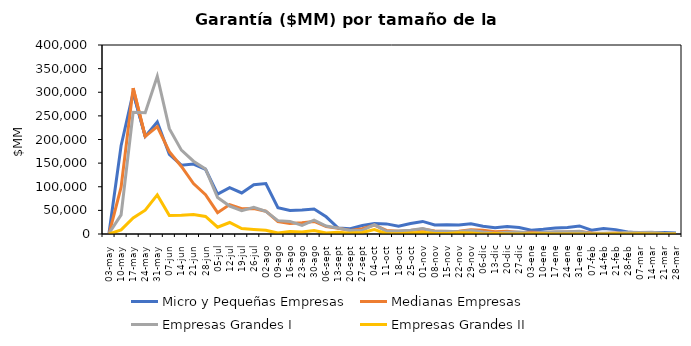
| Category | Micro y Pequeñas Empresas | Medianas Empresas | Empresas Grandes I | Empresas Grandes II |
|---|---|---|---|---|
| 03-may | 2245.341 | 312.806 | 1572.2 | 0 |
| 10-may | 186871.734 | 99187.395 | 40528.793 | 8728.201 |
| 17-may | 299478.83 | 308515.01 | 257638.752 | 33872.61 |
| 24-may | 206493.541 | 206610.334 | 256467.639 | 50409.775 |
| 31-may | 237033.767 | 227173.431 | 333829.394 | 82722.207 |
| 07-jun | 168430.835 | 174225.76 | 222870.427 | 39368.558 |
| 14-jun | 145669.279 | 142859.173 | 177457.248 | 39457.108 |
| 21-jun | 148117.628 | 106887.708 | 154095.648 | 41424.976 |
| 28-jun | 137005.586 | 83359.523 | 137665.001 | 37239.059 |
| 05-jul | 84470.175 | 45228.599 | 77058.893 | 14506.017 |
| 12-jul | 98291.609 | 62208.539 | 59109.844 | 24377.904 |
| 19-jul | 86793.781 | 53545.58 | 49555.627 | 11479.805 |
| 26-jul | 104313.915 | 53932.035 | 56246.164 | 9478.107 |
| 02-ago | 106701.511 | 48330.316 | 47981.588 | 7931.642 |
| 09-ago | 55568.666 | 26509.477 | 28254.637 | 2004.004 |
| 16-ago | 49871.578 | 22463.603 | 26635.033 | 5524.394 |
| 23-ago | 50794.477 | 23624.77 | 18121.887 | 4174.011 |
| 30-ago | 52894.751 | 26472.587 | 29352.822 | 7594.796 |
| 06-sept | 36435.889 | 15571.253 | 16731.308 | 2160.002 |
| 13-sept | 12583.316 | 12342.055 | 12449.48 | 3876.831 |
| 20-sept | 11182.068 | 7437.242 | 7446.226 | 1860 |
| 27-sept | 18035.682 | 11149.624 | 7859.521 | 3091.201 |
| 04-oct | 22095.162 | 18842.566 | 19813.722 | 9184.269 |
| 11-oct | 21423.009 | 7571.144 | 5521.096 | 693.822 |
| 18-oct | 16557.437 | 5817.205 | 6602.677 | 604.842 |
| 25-oct | 22217.791 | 7302.248 | 8093.74 | 1984.84 |
| 01-nov | 26622.334 | 10477.784 | 11669.759 | 3450.788 |
| 08-nov | 18997.477 | 6391.211 | 5180.751 | 1112.42 |
| 15-nov | 19316.136 | 5125.732 | 5690.325 | 900 |
| 22-nov | 18941.11 | 5681.345 | 4816.955 | 2727 |
| 29-nov | 21819.279 | 8994.209 | 7908.981 | 2062.2 |
| 06-dic | 16357.861 | 7851.503 | 4235.913 | 241.938 |
| 13-dic | 13031.319 | 4680.343 | 1769.271 | 1200 |
| 20-dic | 16005.017 | 5871.981 | 3798.322 | 0 |
| 27-dic | 13750.323 | 3366.067 | 4051.494 | 0 |
| 03-ene | 8207.37 | 3521.809 | 1358.175 | 480 |
| 10-ene | 10142.222 | 3187.405 | 3423.543 | 780 |
| 17-ene | 12845.809 | 3863.316 | 4666.795 | 0 |
| 24-ene | 13720.677 | 4336.939 | 4630.913 | 0 |
| 31-ene | 17044.55 | 5287.091 | 5823.587 | 0 |
| 07-feb | 8055.065 | 2239.765 | 701.132 | 0 |
| 14-feb | 11748.094 | 1245.1 | 1527.13 | 0 |
| 21-feb | 9268.649 | 2141.434 | 1613.266 | 600 |
| 28-feb | 4130.476 | 1777.645 | 3850.003 | 240 |
| 07-mar | 2352.838 | 1338.392 | 3360 | 420 |
| 14-mar | 2574.677 | 1207.419 | 3582.042 | 0 |
| 21-mar | 3037.104 | 752.875 | 1421 | 0 |
| 28-mar | 2177.944 | 1264.071 | 1123.15 | 0 |